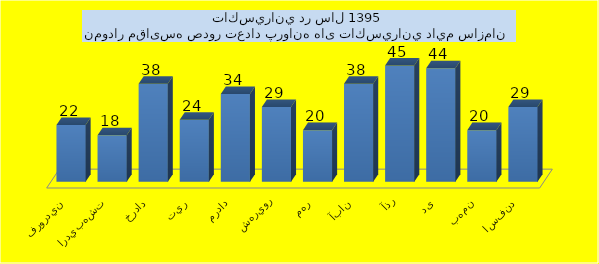
| Category | تعداد |
|---|---|
| فروردين | 22 |
| ارديبهشت | 18 |
| خرداد | 38 |
| تير | 24 |
| مرداد | 34 |
| شهريور | 29 |
| مهر | 20 |
| آبان | 38 |
| آذر | 45 |
| دی | 44 |
| بهمن | 20 |
| اسفند | 29 |